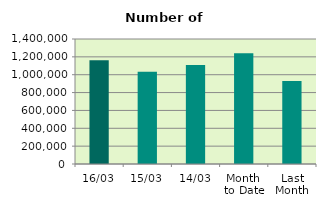
| Category | Series 0 |
|---|---|
| 16/03 | 1161728 |
| 15/03 | 1032966 |
| 14/03 | 1109348 |
| Month 
to Date | 1241725.667 |
| Last
Month | 928647.7 |